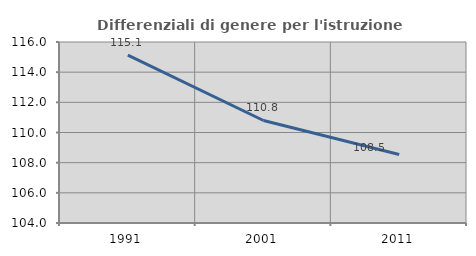
| Category | Differenziali di genere per l'istruzione superiore |
|---|---|
| 1991.0 | 115.125 |
| 2001.0 | 110.796 |
| 2011.0 | 108.545 |